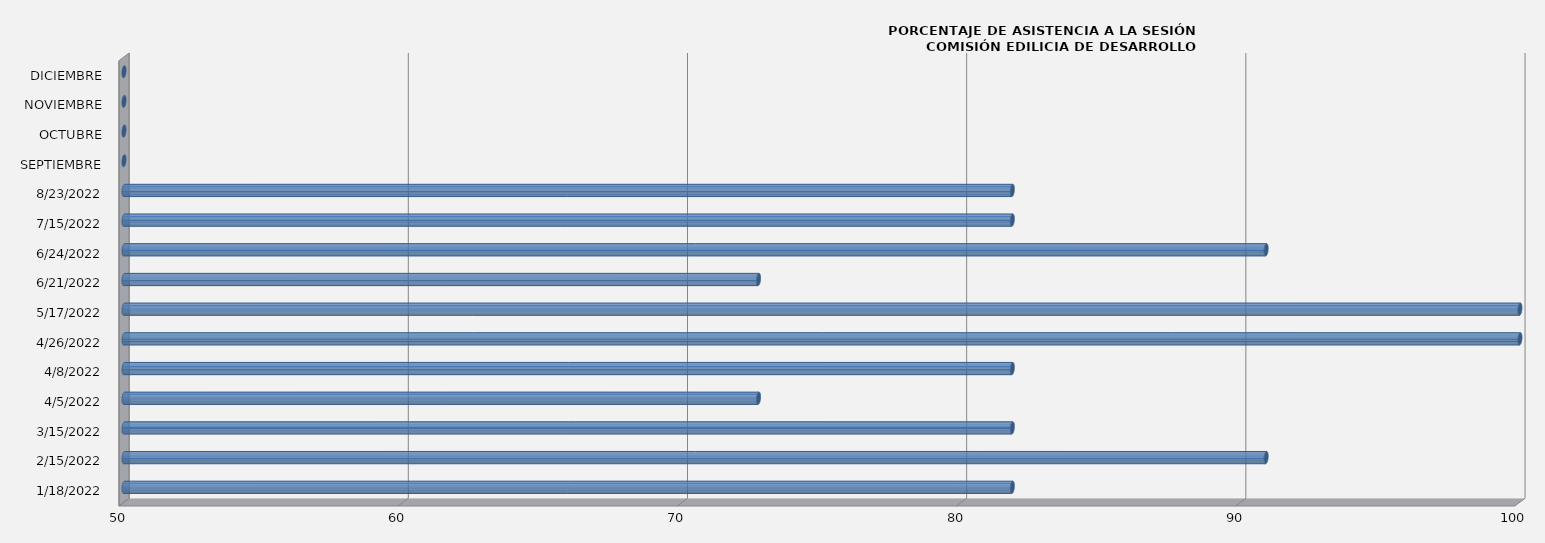
| Category | Series 0 |
|---|---|
| 18/01/2022 | 81.818 |
| 15/02/2022 | 90.909 |
| 15/03/2022 | 81.818 |
| 05/04/2022 | 72.727 |
| 08/04/2022 | 81.818 |
| 26/04/2022 | 100 |
| 17/05/2022 | 100 |
| 21/06/2022 | 72.727 |
| 24/06/2022 | 90.909 |
| 15/07/2022 | 81.818 |
| 23/08/2022 | 81.818 |
| SEPTIEMBRE | 0 |
| OCTUBRE | 0 |
| NOVIEMBRE | 0 |
| DICIEMBRE | 0 |